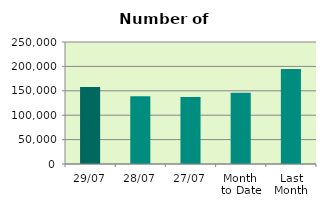
| Category | Series 0 |
|---|---|
| 29/07 | 157642 |
| 28/07 | 138748 |
| 27/07 | 137376 |
| Month 
to Date | 146259.524 |
| Last
Month | 194460.727 |